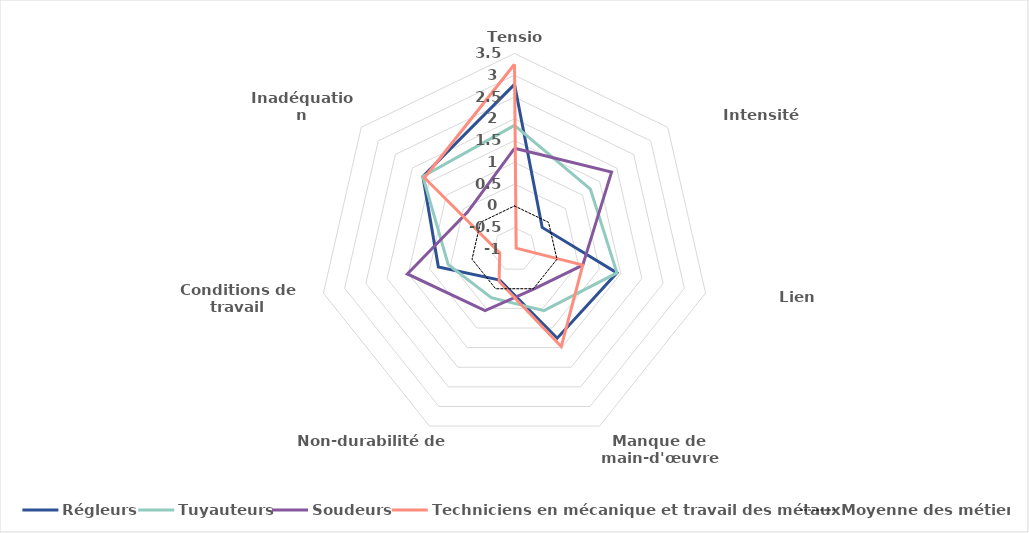
| Category | Régleurs | Tuyauteurs | Soudeurs | Techniciens en mécanique et travail des métaux | Moyenne des métiers |
|---|---|---|---|---|---|
| Tension | 2.792 | 1.851 | 1.324 | 3.252 | 0 |
| Intensité d'embauches | -0.187 | 1.228 | 1.85 | -0.951 | 0 |
| Lien formation-emploi | 1.413 | 1.413 | 0.607 | 0.607 | 0 |
| Manque de main-d'œuvre disponible | 1.26 | 0.558 | 0.012 | 1.475 | 0 |
| Non-durabilité de l'emploi | -0.22 | 0.226 | 0.557 | -0.184 | 0 |
| Conditions de travail contraignantes | 0.793 | 0.561 | 1.523 | -0.652 | 0 |
| Inadéquation géographique | 1.69 | 1.691 | 0.378 | 1.644 | 0 |